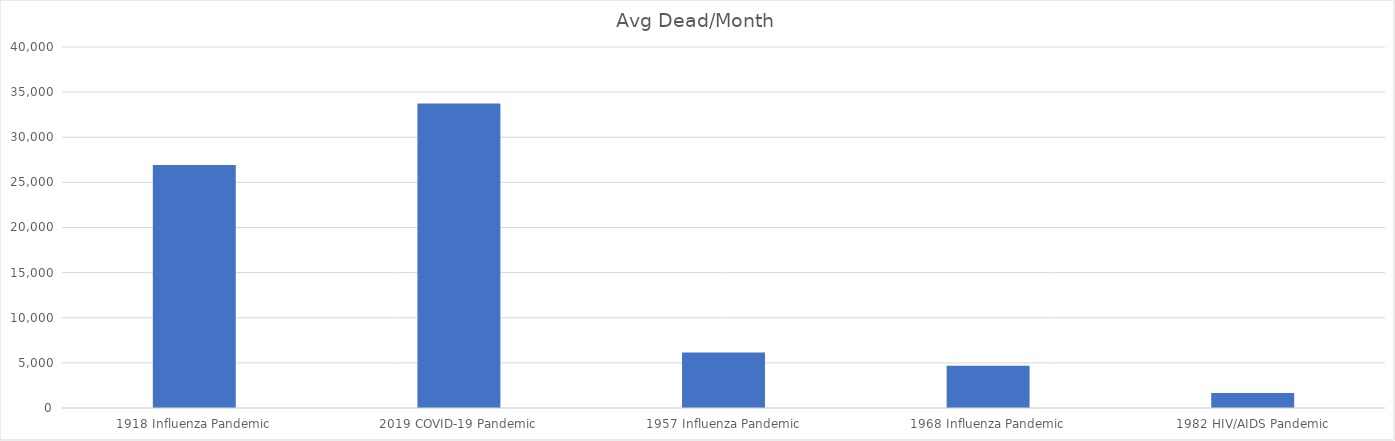
| Category | Avg Dead/Month |
|---|---|
| 1918 Influenza Pandemic | 26923.077 |
| 2019 COVID-19 Pandemic | 33750 |
| 1957 Influenza Pandemic | 6153.846 |
| 1968 Influenza Pandemic | 4687.5 |
| 1982 HIV/AIDS Pandemic | 1648.822 |